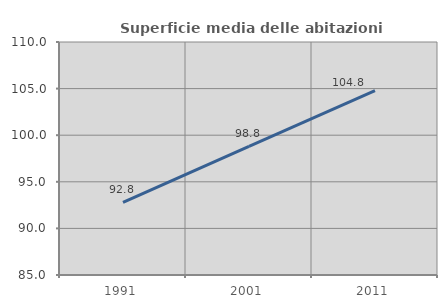
| Category | Superficie media delle abitazioni occupate |
|---|---|
| 1991.0 | 92.781 |
| 2001.0 | 98.813 |
| 2011.0 | 104.782 |